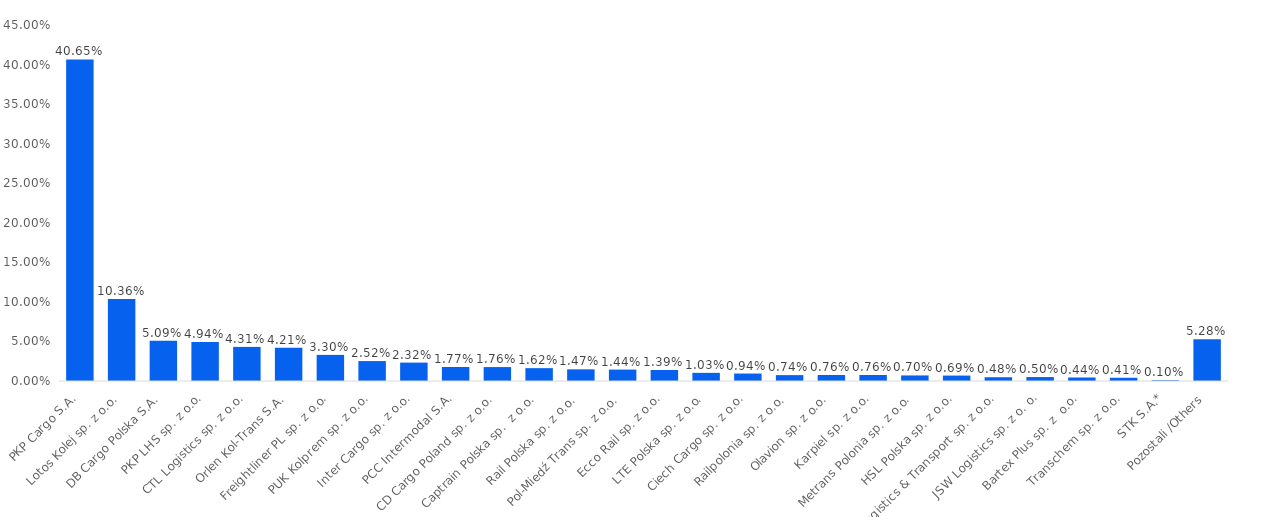
| Category | 2020 |
|---|---|
| PKP Cargo S.A. | 0.407 |
| Lotos Kolej sp. z o.o. | 0.104 |
| DB Cargo Polska S.A. | 0.051 |
| PKP LHS sp. z o.o. | 0.049 |
| CTL Logistics sp. z o.o. | 0.043 |
| Orlen Kol-Trans S.A. | 0.042 |
| Freightliner PL sp. z o.o. | 0.033 |
| PUK Kolprem sp. z o.o. | 0.025 |
| Inter Cargo sp. z o.o. | 0.023 |
| PCC Intermodal S.A. | 0.018 |
| CD Cargo Poland sp. z o.o. | 0.018 |
| Captrain Polska sp.  z o.o. | 0.016 |
| Rail Polska sp. z o.o. | 0.015 |
| Pol-Miedź Trans sp. z o.o. | 0.014 |
| Ecco Rail sp. z o.o. | 0.014 |
| LTE Polska sp. z o.o. | 0.01 |
| Ciech Cargo sp. z o.o. | 0.009 |
| Railpolonia sp. z o.o. | 0.007 |
| Olavion sp. z o.o. | 0.008 |
|  Karpiel sp. z o.o. | 0.008 |
| Metrans Polonia sp. z o.o. | 0.007 |
| HSL Polska sp. z o.o. | 0.007 |
| Logistics & Transport sp. z o.o. | 0.005 |
| JSW Logistics sp. z o. o. | 0.005 |
| Bartex Plus sp. z  o.o. | 0.004 |
| Transchem sp. z o.o. | 0.004 |
| STK S.A.* | 0.001 |
| Pozostali /Others | 0.053 |